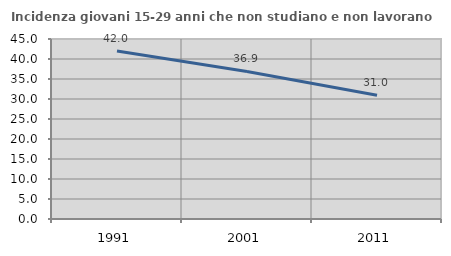
| Category | Incidenza giovani 15-29 anni che non studiano e non lavorano  |
|---|---|
| 1991.0 | 42.013 |
| 2001.0 | 36.88 |
| 2011.0 | 30.963 |